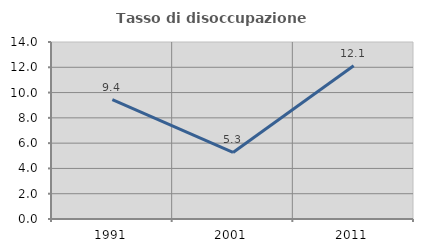
| Category | Tasso di disoccupazione giovanile  |
|---|---|
| 1991.0 | 9.434 |
| 2001.0 | 5.263 |
| 2011.0 | 12.121 |